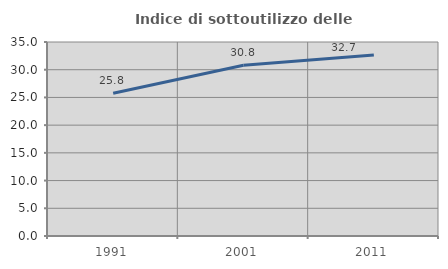
| Category | Indice di sottoutilizzo delle abitazioni  |
|---|---|
| 1991.0 | 25.763 |
| 2001.0 | 30.816 |
| 2011.0 | 32.67 |